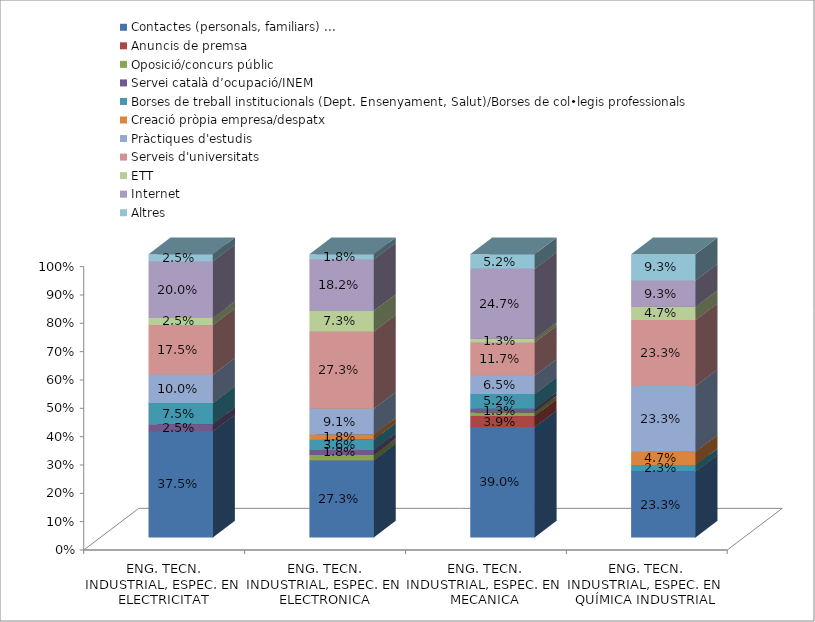
| Category | Contactes (personals, familiars) ... | Anuncis de premsa | Oposició/concurs públic | Servei català d’ocupació/INEM | Borses de treball institucionals (Dept. Ensenyament, Salut)/Borses de col•legis professionals | Creació pròpia empresa/despatx | Pràctiques d'estudis | Serveis d'universitats | ETT | Internet | Altres |
|---|---|---|---|---|---|---|---|---|---|---|---|
| ENG. TECN. INDUSTRIAL, ESPEC. EN ELECTRICITAT | 0.375 | 0 | 0 | 0.025 | 0.075 | 0 | 0.1 | 0.175 | 0.025 | 0.2 | 0.025 |
| ENG. TECN. INDUSTRIAL, ESPEC. EN ELECTRONICA INDUSTRIAL | 0.273 | 0 | 0.018 | 0.018 | 0.036 | 0.018 | 0.091 | 0.273 | 0.073 | 0.182 | 0.018 |
| ENG. TECN. INDUSTRIAL, ESPEC. EN MECANICA | 0.39 | 0.039 | 0.013 | 0.013 | 0.052 | 0 | 0.065 | 0.117 | 0.013 | 0.247 | 0.052 |
| ENG. TECN. INDUSTRIAL, ESPEC. EN QUÍMICA INDUSTRIAL | 0.233 | 0 | 0 | 0 | 0.023 | 0.047 | 0.233 | 0.233 | 0.047 | 0.093 | 0.093 |